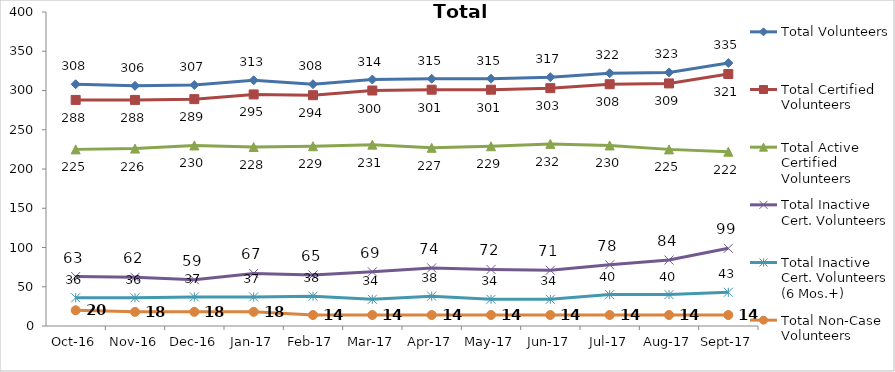
| Category | Total Volunteers | Total Certified Volunteers | Total Active Certified Volunteers | Total Inactive Cert. Volunteers | Total Inactive Cert. Volunteers (6 Mos.+) | Total Non-Case Volunteers |
|---|---|---|---|---|---|---|
| 2016-10-01 | 308 | 288 | 225 | 63 | 36 | 20 |
| 2016-11-01 | 306 | 288 | 226 | 62 | 36 | 18 |
| 2016-12-01 | 307 | 289 | 230 | 59 | 37 | 18 |
| 2017-01-01 | 313 | 295 | 228 | 67 | 37 | 18 |
| 2017-02-01 | 308 | 294 | 229 | 65 | 38 | 14 |
| 2017-03-01 | 314 | 300 | 231 | 69 | 34 | 14 |
| 2017-04-01 | 315 | 301 | 227 | 74 | 38 | 14 |
| 2017-05-01 | 315 | 301 | 229 | 72 | 34 | 14 |
| 2017-06-01 | 317 | 303 | 232 | 71 | 34 | 14 |
| 2017-07-01 | 322 | 308 | 230 | 78 | 40 | 14 |
| 2017-08-01 | 323 | 309 | 225 | 84 | 40 | 14 |
| 2017-09-01 | 335 | 321 | 222 | 99 | 43 | 14 |